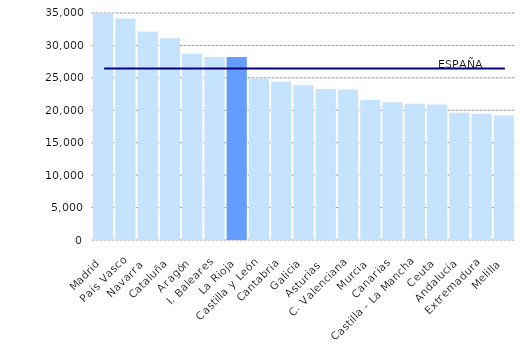
| Category | Series 1 |
|---|---|
| Madrid | 35913 |
| País Vasco | 34142 |
| Navarra  | 32141 |
| Cataluña | 31119 |
| Aragón | 28727 |
| I. Baleares | 28213 |
| La Rioja | 28200 |
| Castilla y León | 24886 |
| Cantabria | 24383 |
| Galicia | 23873 |
| Asturias  | 23299 |
| C. Valenciana | 23206 |
| Murcia | 21642 |
| Canarias | 21244 |
| Castilla - La Mancha | 21004 |
| Ceuta | 20903 |
| Andalucía | 19633 |
| Extremadura | 19454 |
| Melilla | 19211 |